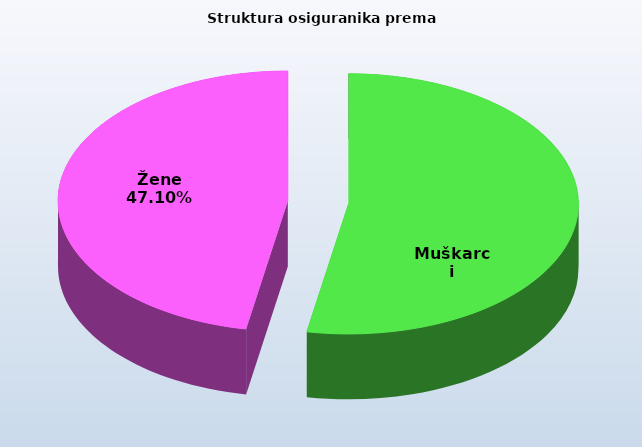
| Category | Series 0 |
|---|---|
| Muškarci | 819534 |
| Žene | 729543 |